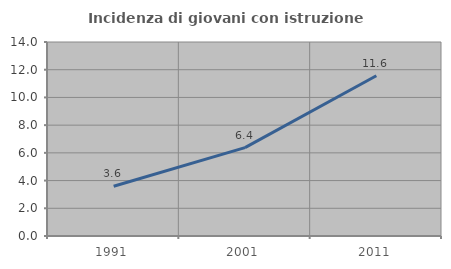
| Category | Incidenza di giovani con istruzione universitaria |
|---|---|
| 1991.0 | 3.587 |
| 2001.0 | 6.376 |
| 2011.0 | 11.565 |